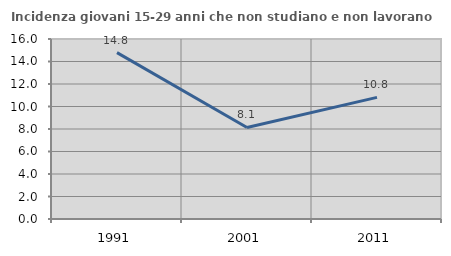
| Category | Incidenza giovani 15-29 anni che non studiano e non lavorano  |
|---|---|
| 1991.0 | 14.793 |
| 2001.0 | 8.134 |
| 2011.0 | 10.811 |